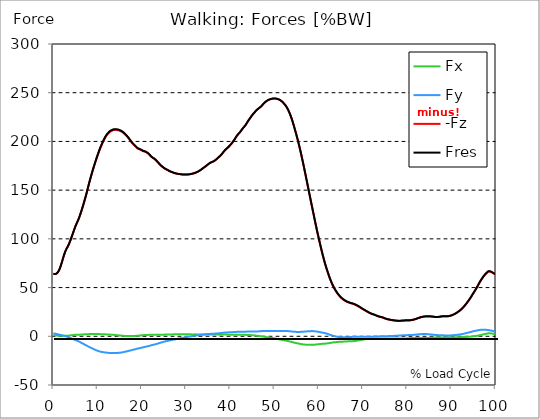
| Category |  Fx |  Fy |  -Fz |  Fres |
|---|---|---|---|---|
| 0.0 | 1.234 | 3.096 | 64.04 | 64.142 |
| 0.167348456675344 | 1.119 | 2.885 | 63.886 | 63.972 |
| 0.334696913350688 | 0.994 | 2.696 | 63.828 | 63.902 |
| 0.5020453700260321 | 0.894 | 2.522 | 63.906 | 63.97 |
| 0.669393826701376 | 0.805 | 2.358 | 64.155 | 64.212 |
| 0.83674228337672 | 0.72 | 2.203 | 64.686 | 64.738 |
| 1.0040907400520642 | 0.668 | 2.036 | 65.62 | 65.666 |
| 1.1621420602454444 | 0.618 | 1.858 | 66.815 | 66.855 |
| 1.3294905169207885 | 0.573 | 1.696 | 68.214 | 68.249 |
| 1.4968389735961325 | 0.542 | 1.52 | 70.073 | 70.104 |
| 1.6641874302714765 | 0.519 | 1.338 | 72.213 | 72.241 |
| 1.8315358869468206 | 0.505 | 1.149 | 74.565 | 74.589 |
| 1.9988843436221646 | 0.51 | 0.959 | 77.125 | 77.146 |
| 2.1662328002975086 | 0.519 | 0.793 | 79.744 | 79.764 |
| 2.333581256972853 | 0.524 | 0.645 | 82.282 | 82.3 |
| 2.5009297136481967 | 0.534 | 0.497 | 84.586 | 84.603 |
| 2.6682781703235405 | 0.558 | 0.31 | 86.686 | 86.703 |
| 2.8356266269988843 | 0.589 | 0.061 | 88.453 | 88.471 |
| 3.002975083674229 | 0.609 | -0.251 | 89.998 | 90.018 |
| 3.1703235403495724 | 0.63 | -0.571 | 91.43 | 91.454 |
| 3.337671997024917 | 0.657 | -0.892 | 92.795 | 92.823 |
| 3.4957233172182973 | 0.73 | -1.174 | 94.458 | 94.488 |
| 3.663071773893641 | 0.81 | -1.455 | 96.182 | 96.215 |
| 3.8304202305689854 | 0.912 | -1.748 | 98.15 | 98.191 |
| 3.997768687244329 | 1.029 | -2.046 | 100.228 | 100.277 |
| 4.165117143919673 | 1.139 | -2.332 | 102.373 | 102.429 |
| 4.332465600595017 | 1.227 | -2.623 | 104.51 | 104.573 |
| 4.499814057270361 | 1.304 | -2.924 | 106.62 | 106.692 |
| 4.667162513945706 | 1.385 | -3.246 | 108.829 | 108.913 |
| 4.834510970621049 | 1.448 | -3.563 | 110.949 | 111.044 |
| 5.001859427296393 | 1.503 | -3.879 | 112.944 | 113.049 |
| 5.169207883971737 | 1.531 | -4.189 | 114.746 | 114.862 |
| 5.336556340647081 | 1.545 | -4.502 | 116.469 | 116.594 |
| 5.503904797322425 | 1.55 | -4.815 | 118.131 | 118.264 |
| 5.671253253997769 | 1.565 | -5.146 | 119.854 | 119.998 |
| 5.82930457419115 | 1.596 | -5.5 | 121.768 | 121.926 |
| 5.996653030866494 | 1.636 | -5.866 | 123.89 | 124.063 |
| 6.164001487541838 | 1.689 | -6.255 | 126.108 | 126.298 |
| 6.331349944217181 | 1.753 | -6.666 | 128.408 | 128.617 |
| 6.498698400892526 | 1.808 | -7.069 | 130.806 | 131.035 |
| 6.66604685756787 | 1.866 | -7.482 | 133.273 | 133.523 |
| 6.833395314243213 | 1.921 | -7.89 | 135.807 | 136.077 |
| 7.000743770918558 | 1.983 | -8.295 | 138.384 | 138.675 |
| 7.168092227593902 | 2.057 | -8.72 | 140.992 | 141.306 |
| 7.335440684269246 | 2.1 | -9.121 | 143.683 | 144.017 |
| 7.50278914094459 | 2.141 | -9.514 | 146.497 | 146.852 |
| 7.6701375976199335 | 2.157 | -9.901 | 149.419 | 149.794 |
| 7.837486054295278 | 2.178 | -10.296 | 152.395 | 152.789 |
| 7.995537374488658 | 2.205 | -10.691 | 155.434 | 155.846 |
| 8.162885831164003 | 2.228 | -11.085 | 158.328 | 158.761 |
| 8.330234287839346 | 2.261 | -11.45 | 161.122 | 161.573 |
| 8.49758274451469 | 2.277 | -11.814 | 163.797 | 164.268 |
| 8.664931201190035 | 2.294 | -12.178 | 166.418 | 166.908 |
| 8.832279657865378 | 2.306 | -12.547 | 169 | 169.51 |
| 8.999628114540721 | 2.309 | -12.913 | 171.503 | 172.034 |
| 9.166976571216066 | 2.305 | -13.276 | 173.952 | 174.503 |
| 9.334325027891412 | 2.299 | -13.63 | 176.349 | 176.92 |
| 9.501673484566755 | 2.292 | -13.973 | 178.718 | 179.309 |
| 9.669021941242098 | 2.285 | -14.305 | 181.054 | 181.665 |
| 9.836370397917442 | 2.28 | -14.607 | 183.32 | 183.947 |
| 10.003718854592787 | 2.274 | -14.873 | 185.488 | 186.131 |
| 10.17106731126813 | 2.264 | -15.125 | 187.621 | 188.275 |
| 10.329118631461512 | 2.254 | -15.366 | 189.712 | 190.38 |
| 10.496467088136853 | 2.232 | -15.599 | 191.74 | 192.42 |
| 10.663815544812199 | 2.205 | -15.808 | 193.682 | 194.372 |
| 10.831164001487544 | 2.173 | -15.979 | 195.488 | 196.186 |
| 10.998512458162887 | 2.138 | -16.119 | 197.199 | 197.901 |
| 11.16586091483823 | 2.105 | -16.252 | 198.85 | 199.558 |
| 11.333209371513574 | 2.073 | -16.383 | 200.485 | 201.199 |
| 11.50055782818892 | 2.04 | -16.499 | 202.03 | 202.747 |
| 11.667906284864264 | 2.011 | -16.598 | 203.485 | 204.205 |
| 11.835254741539607 | 1.977 | -16.69 | 204.833 | 205.556 |
| 12.00260319821495 | 1.948 | -16.764 | 205.995 | 206.72 |
| 12.169951654890292 | 1.914 | -16.841 | 207.007 | 207.735 |
| 12.337300111565641 | 1.867 | -16.933 | 207.898 | 208.631 |
| 12.504648568240984 | 1.816 | -17.022 | 208.703 | 209.438 |
| 12.662699888434362 | 1.765 | -17.093 | 209.427 | 210.167 |
| 12.830048345109708 | 1.719 | -17.132 | 210.096 | 210.835 |
| 12.997396801785053 | 1.661 | -17.18 | 210.535 | 211.277 |
| 13.164745258460396 | 1.596 | -17.212 | 210.859 | 211.602 |
| 13.33209371513574 | 1.547 | -17.23 | 211.186 | 211.929 |
| 13.499442171811083 | 1.493 | -17.256 | 211.499 | 212.242 |
| 13.666790628486426 | 1.436 | -17.278 | 211.768 | 212.511 |
| 13.834139085161771 | 1.367 | -17.266 | 211.944 | 212.685 |
| 14.001487541837117 | 1.287 | -17.238 | 211.913 | 212.653 |
| 14.16883599851246 | 1.225 | -17.191 | 211.855 | 212.591 |
| 14.336184455187803 | 1.148 | -17.126 | 211.776 | 212.508 |
| 14.503532911863147 | 1.057 | -17.051 | 211.668 | 212.397 |
| 14.670881368538492 | 0.978 | -17.001 | 211.485 | 212.211 |
| 14.828932688731873 | 0.921 | -16.948 | 211.244 | 211.967 |
| 14.996281145407215 | 0.876 | -16.878 | 210.952 | 211.672 |
| 15.163629602082558 | 0.809 | -16.78 | 210.609 | 211.324 |
| 15.330978058757903 | 0.743 | -16.674 | 210.253 | 210.961 |
| 15.498326515433247 | 0.672 | -16.571 | 209.864 | 210.567 |
| 15.665674972108594 | 0.59 | -16.45 | 209.35 | 210.046 |
| 15.833023428783937 | 0.486 | -16.269 | 208.73 | 209.415 |
| 16.00037188545928 | 0.402 | -16.074 | 208.102 | 208.774 |
| 16.167720342134626 | 0.366 | -15.902 | 207.45 | 208.111 |
| 16.335068798809967 | 0.322 | -15.745 | 206.676 | 207.328 |
| 16.502417255485312 | 0.299 | -15.554 | 205.845 | 206.485 |
| 16.669765712160658 | 0.3 | -15.355 | 205.004 | 205.633 |
| 16.837114168836 | 0.31 | -15.167 | 204.16 | 204.778 |
| 17.004462625511344 | 0.309 | -15 | 203.239 | 203.846 |
| 17.16251394570472 | 0.285 | -14.846 | 202.262 | 202.862 |
| 17.32986240238007 | 0.261 | -14.652 | 201.124 | 201.712 |
| 17.497210859055414 | 0.265 | -14.458 | 200.014 | 200.59 |
| 17.664559315730756 | 0.269 | -14.289 | 199.11 | 199.677 |
| 17.8319077724061 | 0.276 | -14.071 | 198.21 | 198.764 |
| 17.999256229081443 | 0.298 | -13.86 | 197.396 | 197.937 |
| 18.166604685756788 | 0.33 | -13.65 | 196.625 | 197.154 |
| 18.333953142432133 | 0.374 | -13.453 | 195.865 | 196.383 |
| 18.501301599107478 | 0.415 | -13.271 | 195.061 | 195.569 |
| 18.668650055782823 | 0.455 | -13.082 | 194.271 | 194.77 |
| 18.835998512458165 | 0.493 | -12.864 | 193.561 | 194.049 |
| 19.00334696913351 | 0.532 | -12.655 | 192.92 | 193.396 |
| 19.170695425808855 | 0.593 | -12.49 | 192.456 | 192.924 |
| 19.338043882484197 | 0.673 | -12.356 | 192.122 | 192.583 |
| 19.496095202677576 | 0.759 | -12.192 | 191.891 | 192.343 |
| 19.66344365935292 | 0.845 | -12.015 | 191.654 | 192.097 |
| 19.830792116028263 | 0.941 | -11.837 | 191.172 | 191.605 |
| 19.998140572703612 | 1.02 | -11.663 | 190.596 | 191.022 |
| 20.165489029378953 | 1.097 | -11.461 | 190.273 | 190.691 |
| 20.3328374860543 | 1.171 | -11.27 | 189.975 | 190.387 |
| 20.500185942729644 | 1.247 | -11.094 | 189.77 | 190.175 |
| 20.667534399404985 | 1.311 | -10.917 | 189.557 | 189.954 |
| 20.83488285608033 | 1.341 | -10.742 | 189.265 | 189.656 |
| 21.002231312755672 | 1.359 | -10.574 | 188.857 | 189.239 |
| 21.16957976943102 | 1.386 | -10.43 | 188.415 | 188.79 |
| 21.336928226106362 | 1.407 | -10.269 | 187.952 | 188.32 |
| 21.504276682781704 | 1.43 | -10.086 | 187.368 | 187.725 |
| 21.67162513945705 | 1.466 | -9.875 | 186.606 | 186.95 |
| 21.82967645965043 | 1.493 | -9.648 | 185.761 | 186.092 |
| 21.997024916325774 | 1.497 | -9.424 | 184.864 | 185.182 |
| 22.16437337300112 | 1.507 | -9.219 | 184.121 | 184.427 |
| 22.33172182967646 | 1.51 | -8.997 | 183.518 | 183.814 |
| 22.499070286351806 | 1.51 | -8.785 | 183.014 | 183.303 |
| 22.666418743027148 | 1.519 | -8.603 | 182.566 | 182.848 |
| 22.833767199702496 | 1.555 | -8.476 | 182.073 | 182.35 |
| 23.00111565637784 | 1.564 | -8.305 | 181.524 | 181.793 |
| 23.168464113053183 | 1.574 | -8.087 | 180.813 | 181.07 |
| 23.335812569728528 | 1.574 | -7.859 | 180.006 | 180.252 |
| 23.50316102640387 | 1.561 | -7.633 | 179.185 | 179.419 |
| 23.670509483079215 | 1.553 | -7.41 | 178.362 | 178.587 |
| 23.83785793975456 | 1.558 | -7.15 | 177.503 | 177.715 |
| 23.995909259947936 | 1.574 | -6.894 | 176.67 | 176.869 |
| 24.163257716623285 | 1.604 | -6.689 | 175.918 | 176.108 |
| 24.330606173298627 | 1.631 | -6.489 | 175.17 | 175.35 |
| 24.49795462997397 | 1.642 | -6.271 | 174.492 | 174.661 |
| 24.665303086649313 | 1.666 | -6.052 | 173.914 | 174.075 |
| 24.83265154332466 | 1.685 | -5.825 | 173.338 | 173.488 |
| 25.0 | 1.693 | -5.599 | 172.754 | 172.896 |
| 25.167348456675345 | 1.727 | -5.406 | 172.243 | 172.378 |
| 25.334696913350694 | 1.764 | -5.227 | 171.788 | 171.917 |
| 25.502045370026035 | 1.795 | -5.051 | 171.351 | 171.475 |
| 25.669393826701377 | 1.809 | -4.873 | 170.982 | 171.1 |
| 25.836742283376722 | 1.82 | -4.699 | 170.607 | 170.72 |
| 26.004090740052067 | 1.832 | -4.525 | 170.221 | 170.328 |
| 26.17143919672741 | 1.833 | -4.356 | 169.776 | 169.876 |
| 26.329490516920792 | 1.842 | -4.204 | 169.373 | 169.469 |
| 26.49683897359613 | 1.857 | -4.042 | 169.011 | 169.103 |
| 26.66418743027148 | 1.892 | -3.881 | 168.71 | 168.798 |
| 26.831535886946828 | 1.93 | -3.726 | 168.445 | 168.53 |
| 26.998884343622166 | 1.956 | -3.573 | 168.175 | 168.258 |
| 27.166232800297514 | 1.981 | -3.417 | 167.886 | 167.967 |
| 27.333581256972852 | 1.993 | -3.274 | 167.592 | 167.67 |
| 27.5009297136482 | 2.013 | -3.125 | 167.343 | 167.417 |
| 27.668278170323543 | 2.035 | -2.972 | 167.126 | 167.196 |
| 27.835626626998888 | 2.049 | -2.811 | 166.964 | 167.032 |
| 28.002975083674233 | 2.057 | -2.654 | 166.821 | 166.884 |
| 28.170323540349575 | 2.069 | -2.504 | 166.692 | 166.753 |
| 28.33767199702492 | 2.077 | -2.358 | 166.57 | 166.628 |
| 28.50502045370026 | 2.081 | -2.211 | 166.455 | 166.512 |
| 28.663071773893645 | 2.084 | -2.076 | 166.345 | 166.398 |
| 28.830420230568986 | 2.08 | -1.949 | 166.258 | 166.31 |
| 28.99776868724433 | 2.069 | -1.827 | 166.175 | 166.226 |
| 29.165117143919673 | 2.055 | -1.7 | 166.098 | 166.146 |
| 29.33246560059502 | 2.053 | -1.546 | 166.044 | 166.089 |
| 29.499814057270367 | 2.052 | -1.386 | 165.994 | 166.036 |
| 29.66716251394571 | 2.044 | -1.24 | 165.987 | 166.028 |
| 29.834510970621054 | 2.031 | -1.098 | 165.983 | 166.021 |
| 30.00185942729639 | 2.02 | -0.944 | 166.004 | 166.041 |
| 30.169207883971744 | 2.017 | -0.786 | 166.036 | 166.069 |
| 30.33655634064708 | 2.01 | -0.626 | 166.067 | 166.098 |
| 30.50390479732243 | 1.996 | -0.479 | 166.132 | 166.161 |
| 30.671253253997772 | 1.979 | -0.342 | 166.223 | 166.252 |
| 30.829304574191156 | 1.97 | -0.214 | 166.321 | 166.347 |
| 30.996653030866494 | 1.966 | -0.084 | 166.451 | 166.477 |
| 31.164001487541842 | 1.96 | 0.042 | 166.604 | 166.628 |
| 31.331349944217187 | 1.956 | 0.161 | 166.776 | 166.799 |
| 31.498698400892525 | 1.953 | 0.279 | 166.953 | 166.977 |
| 31.666046857567874 | 1.95 | 0.402 | 167.162 | 167.186 |
| 31.833395314243212 | 1.954 | 0.518 | 167.401 | 167.425 |
| 32.00074377091856 | 1.962 | 0.63 | 167.667 | 167.689 |
| 32.1680922275939 | 1.965 | 0.746 | 167.949 | 167.971 |
| 32.33544068426925 | 1.961 | 0.859 | 168.251 | 168.273 |
| 32.50278914094459 | 1.954 | 0.968 | 168.571 | 168.594 |
| 32.670137597619934 | 1.949 | 1.073 | 168.941 | 168.964 |
| 32.83748605429528 | 1.946 | 1.183 | 169.382 | 169.406 |
| 33.004834510970625 | 1.946 | 1.287 | 169.843 | 169.867 |
| 33.162885831164004 | 1.948 | 1.382 | 170.321 | 170.345 |
| 33.33023428783935 | 1.948 | 1.471 | 170.796 | 170.822 |
| 33.497582744514695 | 1.943 | 1.552 | 171.349 | 171.376 |
| 33.664931201190036 | 1.933 | 1.634 | 171.99 | 172.017 |
| 33.83227965786538 | 1.926 | 1.726 | 172.527 | 172.555 |
| 33.99962811454073 | 1.914 | 1.818 | 173.053 | 173.081 |
| 34.16697657121607 | 1.897 | 1.924 | 173.589 | 173.618 |
| 34.33432502789141 | 1.881 | 2.029 | 174.127 | 174.157 |
| 34.50167348456676 | 1.873 | 2.117 | 174.709 | 174.74 |
| 34.6690219412421 | 1.868 | 2.184 | 175.298 | 175.33 |
| 34.83637039791744 | 1.86 | 2.246 | 175.939 | 175.971 |
| 35.00371885459279 | 1.854 | 2.309 | 176.567 | 176.6 |
| 35.17106731126814 | 1.835 | 2.347 | 177.151 | 177.184 |
| 35.338415767943474 | 1.831 | 2.406 | 177.667 | 177.701 |
| 35.49646708813686 | 1.816 | 2.468 | 178.122 | 178.155 |
| 35.6638155448122 | 1.796 | 2.522 | 178.485 | 178.519 |
| 35.831164001487544 | 1.778 | 2.568 | 178.814 | 178.847 |
| 35.998512458162885 | 1.759 | 2.598 | 179.111 | 179.144 |
| 36.165860914838234 | 1.74 | 2.621 | 179.41 | 179.443 |
| 36.333209371513576 | 1.718 | 2.655 | 179.859 | 179.892 |
| 36.50055782818892 | 1.712 | 2.708 | 180.383 | 180.417 |
| 36.667906284864266 | 1.711 | 2.758 | 180.939 | 180.975 |
| 36.83525474153961 | 1.711 | 2.812 | 181.545 | 181.58 |
| 37.002603198214956 | 1.705 | 2.873 | 182.205 | 182.241 |
| 37.1699516548903 | 1.705 | 2.952 | 182.899 | 182.937 |
| 37.337300111565646 | 1.705 | 3.051 | 183.601 | 183.64 |
| 37.50464856824098 | 1.701 | 3.143 | 184.325 | 184.366 |
| 37.66269988843437 | 1.696 | 3.22 | 184.979 | 185.021 |
| 37.83004834510971 | 1.695 | 3.295 | 185.693 | 185.737 |
| 37.99739680178505 | 1.7 | 3.373 | 186.519 | 186.564 |
| 38.16474525846039 | 1.711 | 3.461 | 187.418 | 187.464 |
| 38.33209371513574 | 1.728 | 3.571 | 188.42 | 188.469 |
| 38.49944217181109 | 1.747 | 3.669 | 189.387 | 189.438 |
| 38.666790628486424 | 1.759 | 3.761 | 190.301 | 190.354 |
| 38.83413908516178 | 1.76 | 3.832 | 191.146 | 191.2 |
| 39.001487541837115 | 1.759 | 3.896 | 191.942 | 191.996 |
| 39.16883599851246 | 1.754 | 3.936 | 192.592 | 192.648 |
| 39.336184455187805 | 1.725 | 3.971 | 193.244 | 193.299 |
| 39.503532911863154 | 1.693 | 4.005 | 193.901 | 193.958 |
| 39.670881368538495 | 1.678 | 4.04 | 194.699 | 194.756 |
| 39.83822982521384 | 1.663 | 4.069 | 195.459 | 195.515 |
| 39.996281145407224 | 1.652 | 4.1 | 196.238 | 196.295 |
| 40.163629602082565 | 1.645 | 4.134 | 197.092 | 197.151 |
| 40.33097805875791 | 1.646 | 4.176 | 198.025 | 198.084 |
| 40.498326515433256 | 1.645 | 4.224 | 199.003 | 199.063 |
| 40.6656749721086 | 1.64 | 4.268 | 200.019 | 200.079 |
| 40.83302342878393 | 1.628 | 4.317 | 201.092 | 201.153 |
| 41.00037188545929 | 1.628 | 4.376 | 202.228 | 202.29 |
| 41.16772034213463 | 1.632 | 4.441 | 203.447 | 203.511 |
| 41.33506879880997 | 1.632 | 4.496 | 204.689 | 204.754 |
| 41.50241725548531 | 1.625 | 4.538 | 205.813 | 205.879 |
| 41.66976571216066 | 1.611 | 4.582 | 206.796 | 206.862 |
| 41.837114168836 | 1.59 | 4.607 | 207.701 | 207.768 |
| 42.004462625511344 | 1.563 | 4.613 | 208.477 | 208.542 |
| 42.17181108218669 | 1.54 | 4.621 | 209.269 | 209.334 |
| 42.32986240238007 | 1.542 | 4.642 | 210.195 | 210.262 |
| 42.497210859055414 | 1.552 | 4.667 | 211.308 | 211.375 |
| 42.66455931573076 | 1.566 | 4.687 | 212.427 | 212.495 |
| 42.831907772406105 | 1.555 | 4.708 | 213.423 | 213.49 |
| 42.999256229081446 | 1.529 | 4.713 | 214.294 | 214.362 |
| 43.16660468575679 | 1.499 | 4.717 | 215.117 | 215.185 |
| 43.33395314243214 | 1.468 | 4.726 | 216.025 | 216.093 |
| 43.50130159910748 | 1.443 | 4.745 | 217.101 | 217.17 |
| 43.66865005578282 | 1.42 | 4.77 | 218.254 | 218.323 |
| 43.83599851245817 | 1.392 | 4.807 | 219.48 | 219.549 |
| 44.00334696913351 | 1.36 | 4.834 | 220.729 | 220.799 |
| 44.17069542580886 | 1.332 | 4.857 | 221.857 | 221.927 |
| 44.3380438824842 | 1.304 | 4.87 | 222.941 | 223.011 |
| 44.49609520267758 | 1.26 | 4.866 | 223.996 | 224.066 |
| 44.66344365935292 | 1.197 | 4.865 | 225.09 | 225.159 |
| 44.83079211602827 | 1.125 | 4.88 | 226.199 | 226.266 |
| 44.99814057270361 | 1.053 | 4.889 | 227.191 | 227.259 |
| 45.16548902937895 | 0.989 | 4.885 | 228.089 | 228.157 |
| 45.332837486054295 | 0.928 | 4.894 | 228.948 | 229.016 |
| 45.500185942729644 | 0.864 | 4.911 | 229.81 | 229.878 |
| 45.66753439940499 | 0.79 | 4.932 | 230.727 | 230.795 |
| 45.83488285608033 | 0.707 | 4.948 | 231.604 | 231.672 |
| 46.00223131275568 | 0.618 | 4.966 | 232.343 | 232.411 |
| 46.16957976943102 | 0.524 | 4.99 | 232.987 | 233.056 |
| 46.336928226106366 | 0.418 | 5.046 | 233.58 | 233.65 |
| 46.50427668278171 | 0.306 | 5.11 | 234.162 | 234.235 |
| 46.671625139457056 | 0.196 | 5.179 | 234.734 | 234.807 |
| 46.829676459650436 | 0.087 | 5.251 | 235.329 | 235.403 |
| 46.99702491632577 | -0.019 | 5.306 | 236.048 | 236.124 |
| 47.16437337300112 | -0.133 | 5.344 | 236.852 | 236.929 |
| 47.33172182967646 | -0.245 | 5.375 | 237.714 | 237.792 |
| 47.49907028635181 | -0.366 | 5.415 | 238.611 | 238.69 |
| 47.66641874302716 | -0.485 | 5.442 | 239.387 | 239.466 |
| 47.83376719970249 | -0.606 | 5.463 | 240.088 | 240.167 |
| 48.001115656377834 | -0.724 | 5.473 | 240.745 | 240.825 |
| 48.16846411305319 | -0.854 | 5.469 | 241.321 | 241.4 |
| 48.33581256972853 | -0.979 | 5.468 | 241.813 | 241.893 |
| 48.50316102640387 | -1.087 | 5.471 | 242.243 | 242.323 |
| 48.67050948307921 | -1.182 | 5.48 | 242.637 | 242.718 |
| 48.837857939754564 | -1.283 | 5.5 | 243.013 | 243.093 |
| 49.005206396429905 | -1.42 | 5.485 | 243.278 | 243.361 |
| 49.163257716623285 | -1.554 | 5.464 | 243.472 | 243.554 |
| 49.33060617329863 | -1.688 | 5.48 | 243.666 | 243.748 |
| 49.49795462997397 | -1.822 | 5.49 | 243.833 | 243.916 |
| 49.66530308664932 | -1.948 | 5.49 | 243.953 | 244.037 |
| 49.832651543324666 | -2.047 | 5.494 | 244.023 | 244.107 |
| 50.0 | -2.196 | 5.497 | 244.011 | 244.096 |
| 50.16734845667534 | -2.352 | 5.513 | 243.971 | 244.058 |
| 50.33469691335069 | -2.484 | 5.492 | 243.899 | 243.987 |
| 50.50204537002604 | -2.624 | 5.481 | 243.752 | 243.842 |
| 50.66939382670139 | -2.762 | 5.464 | 243.541 | 243.632 |
| 50.836742283376715 | -2.902 | 5.444 | 243.288 | 243.379 |
| 51.00409074005207 | -3.063 | 5.447 | 242.983 | 243.076 |
| 51.17143919672741 | -3.207 | 5.444 | 242.613 | 242.708 |
| 51.32949051692079 | -3.35 | 5.445 | 242.155 | 242.253 |
| 51.496838973596134 | -3.494 | 5.442 | 241.642 | 241.742 |
| 51.66418743027148 | -3.653 | 5.464 | 241.086 | 241.188 |
| 51.831535886946824 | -3.808 | 5.48 | 240.382 | 240.488 |
| 51.99888434362217 | -3.945 | 5.465 | 239.567 | 239.674 |
| 52.16623280029752 | -4.085 | 5.442 | 238.705 | 238.815 |
| 52.33358125697285 | -4.234 | 5.421 | 237.81 | 237.921 |
| 52.5009297136482 | -4.389 | 5.406 | 236.826 | 236.941 |
| 52.668278170323546 | -4.545 | 5.401 | 235.686 | 235.804 |
| 52.835626626998895 | -4.699 | 5.383 | 234.446 | 234.567 |
| 53.00297508367424 | -4.855 | 5.349 | 233.098 | 233.222 |
| 53.17032354034958 | -5.012 | 5.287 | 231.53 | 231.656 |
| 53.33767199702492 | -5.186 | 5.227 | 229.845 | 229.976 |
| 53.50502045370027 | -5.373 | 5.125 | 227.98 | 228.113 |
| 53.663071773893655 | -5.562 | 5.038 | 226.035 | 226.172 |
| 53.83042023056899 | -5.76 | 4.952 | 223.935 | 224.076 |
| 53.99776868724433 | -5.965 | 4.847 | 221.625 | 221.771 |
| 54.16511714391967 | -6.168 | 4.758 | 219.186 | 219.335 |
| 54.33246560059503 | -6.366 | 4.679 | 216.623 | 216.778 |
| 54.49981405727037 | -6.555 | 4.611 | 213.999 | 214.16 |
| 54.667162513945705 | -6.729 | 4.566 | 211.32 | 211.487 |
| 54.834510970621054 | -6.895 | 4.531 | 208.588 | 208.762 |
| 55.0018594272964 | -7.054 | 4.499 | 205.81 | 205.99 |
| 55.169207883971744 | -7.208 | 4.472 | 202.985 | 203.173 |
| 55.336556340647086 | -7.359 | 4.461 | 200.062 | 200.257 |
| 55.50390479732243 | -7.514 | 4.468 | 197.003 | 197.209 |
| 55.671253253997776 | -7.67 | 4.485 | 193.875 | 194.09 |
| 55.83860171067312 | -7.823 | 4.513 | 190.635 | 190.861 |
| 55.9966530308665 | -7.969 | 4.553 | 187.3 | 187.537 |
| 56.16400148754184 | -8.104 | 4.607 | 183.876 | 184.125 |
| 56.33134994421718 | -8.227 | 4.672 | 180.408 | 180.669 |
| 56.498698400892536 | -8.343 | 4.741 | 176.876 | 177.15 |
| 56.66604685756788 | -8.453 | 4.808 | 173.258 | 173.545 |
| 56.83339531424321 | -8.545 | 4.872 | 169.604 | 169.901 |
| 57.00074377091856 | -8.619 | 4.935 | 165.945 | 166.254 |
| 57.16809222759391 | -8.672 | 4.993 | 162.217 | 162.537 |
| 57.33544068426925 | -8.703 | 5.036 | 158.505 | 158.837 |
| 57.5027891409446 | -8.735 | 5.085 | 154.765 | 155.108 |
| 57.670137597619934 | -8.76 | 5.142 | 151.007 | 151.362 |
| 57.83748605429528 | -8.772 | 5.196 | 147.232 | 147.598 |
| 58.004834510970625 | -8.783 | 5.24 | 143.541 | 143.917 |
| 58.16288583116401 | -8.787 | 5.28 | 139.815 | 140.203 |
| 58.330234287839346 | -8.782 | 5.306 | 136.108 | 136.506 |
| 58.497582744514695 | -8.763 | 5.313 | 132.424 | 132.831 |
| 58.66493120119004 | -8.729 | 5.296 | 128.794 | 129.209 |
| 58.832279657865385 | -8.678 | 5.236 | 125.139 | 125.559 |
| 58.999628114540734 | -8.617 | 5.165 | 121.453 | 121.879 |
| 59.16697657121607 | -8.548 | 5.089 | 117.791 | 118.221 |
| 59.33432502789142 | -8.473 | 5.01 | 114.161 | 114.596 |
| 59.50167348456676 | -8.391 | 4.921 | 110.579 | 111.016 |
| 59.66902194124211 | -8.299 | 4.811 | 107.096 | 107.535 |
| 59.83637039791745 | -8.207 | 4.684 | 103.701 | 104.141 |
| 60.00371885459278 | -8.111 | 4.554 | 100.376 | 100.816 |
| 60.17106731126813 | -8.018 | 4.41 | 97.116 | 97.556 |
| 60.33841576794349 | -7.93 | 4.243 | 93.889 | 94.328 |
| 60.49646708813685 | -7.843 | 4.07 | 90.694 | 91.134 |
| 60.6638155448122 | -7.766 | 3.91 | 87.58 | 88.02 |
| 60.831164001487544 | -7.711 | 3.759 | 84.546 | 84.99 |
| 60.99851245816289 | -7.662 | 3.611 | 81.553 | 82.003 |
| 61.16586091483824 | -7.623 | 3.468 | 78.646 | 79.102 |
| 61.333209371513576 | -7.588 | 3.329 | 75.881 | 76.342 |
| 61.50055782818892 | -7.528 | 3.161 | 73.246 | 73.709 |
| 61.667906284864266 | -7.436 | 2.948 | 70.769 | 71.228 |
| 61.835254741539615 | -7.345 | 2.729 | 68.358 | 68.814 |
| 62.002603198214956 | -7.238 | 2.476 | 66.031 | 66.482 |
| 62.16995165489029 | -7.116 | 2.195 | 63.748 | 64.19 |
| 62.33730011156564 | -6.992 | 1.92 | 61.552 | 61.985 |
| 62.504648568240995 | -6.873 | 1.652 | 59.443 | 59.869 |
| 62.67199702491633 | -6.743 | 1.384 | 57.48 | 57.899 |
| 62.83004834510971 | -6.61 | 1.125 | 55.654 | 56.067 |
| 62.99739680178505 | -6.49 | 0.866 | 53.919 | 54.326 |
| 63.1647452584604 | -6.368 | 0.619 | 52.214 | 52.615 |
| 63.33209371513575 | -6.268 | 0.397 | 50.648 | 51.046 |
| 63.4994421718111 | -6.182 | 0.193 | 49.2 | 49.596 |
| 63.666790628486424 | -6.109 | 0.017 | 47.907 | 48.303 |
| 63.83413908516177 | -6.027 | -0.15 | 46.669 | 47.065 |
| 64.00148754183712 | -5.943 | -0.306 | 45.463 | 45.858 |
| 64.16883599851248 | -5.875 | -0.442 | 44.358 | 44.756 |
| 64.3361844551878 | -5.816 | -0.568 | 43.32 | 43.72 |
| 64.50353291186315 | -5.762 | -0.674 | 42.37 | 42.772 |
| 64.6708813685385 | -5.689 | -0.776 | 41.435 | 41.839 |
| 64.83822982521384 | -5.642 | -0.842 | 40.581 | 40.986 |
| 65.00557828188919 | -5.606 | -0.892 | 39.801 | 40.211 |
| 65.16362960208257 | -5.573 | -0.945 | 39.082 | 39.495 |
| 65.3309780587579 | -5.547 | -0.995 | 38.42 | 38.837 |
| 65.49832651543326 | -5.515 | -1.024 | 37.81 | 38.229 |
| 65.6656749721086 | -5.47 | -1.047 | 37.255 | 37.673 |
| 65.83302342878395 | -5.423 | -1.063 | 36.756 | 37.173 |
| 66.00037188545929 | -5.387 | -1.049 | 36.309 | 36.726 |
| 66.16772034213463 | -5.345 | -1.035 | 35.884 | 36.299 |
| 66.33506879880998 | -5.281 | -1.013 | 35.461 | 35.87 |
| 66.50241725548531 | -5.232 | -0.986 | 35.102 | 35.507 |
| 66.66976571216065 | -5.183 | -0.943 | 34.795 | 35.196 |
| 66.83711416883601 | -5.122 | -0.898 | 34.504 | 34.899 |
| 67.00446262551135 | -5.085 | -0.84 | 34.23 | 34.622 |
| 67.1718110821867 | -5.044 | -0.769 | 33.967 | 34.354 |
| 67.32986240238007 | -5.034 | -0.692 | 33.76 | 34.146 |
| 67.49721085905541 | -5.024 | -0.613 | 33.593 | 33.979 |
| 67.66455931573076 | -4.997 | -0.554 | 33.38 | 33.763 |
| 67.83190777240611 | -4.947 | -0.519 | 33.108 | 33.487 |
| 67.99925622908145 | -4.894 | -0.483 | 32.815 | 33.189 |
| 68.16660468575678 | -4.831 | -0.459 | 32.515 | 32.882 |
| 68.33395314243214 | -4.741 | -0.449 | 32.189 | 32.547 |
| 68.50130159910749 | -4.631 | -0.449 | 31.834 | 32.179 |
| 68.66865005578282 | -4.5 | -0.459 | 31.459 | 31.79 |
| 68.83599851245816 | -4.361 | -0.475 | 31.054 | 31.369 |
| 69.00334696913352 | -4.224 | -0.49 | 30.628 | 30.93 |
| 69.17069542580886 | -4.085 | -0.51 | 30.187 | 30.473 |
| 69.3380438824842 | -3.942 | -0.532 | 29.724 | 29.997 |
| 69.50539233915956 | -3.797 | -0.551 | 29.239 | 29.497 |
| 69.66344365935292 | -3.654 | -0.561 | 28.749 | 28.994 |
| 69.83079211602826 | -3.52 | -0.57 | 28.286 | 28.517 |
| 69.99814057270362 | -3.391 | -0.566 | 27.84 | 28.059 |
| 70.16548902937896 | -3.262 | -0.563 | 27.395 | 27.601 |
| 70.33283748605429 | -3.138 | -0.557 | 26.949 | 27.143 |
| 70.50018594272964 | -3.021 | -0.549 | 26.505 | 26.69 |
| 70.667534399405 | -2.92 | -0.542 | 26.069 | 26.244 |
| 70.83488285608033 | -2.827 | -0.536 | 25.643 | 25.811 |
| 71.00223131275568 | -2.747 | -0.531 | 25.215 | 25.377 |
| 71.16957976943102 | -2.673 | -0.527 | 24.79 | 24.946 |
| 71.33692822610637 | -2.607 | -0.516 | 24.383 | 24.535 |
| 71.50427668278171 | -2.566 | -0.485 | 23.993 | 24.141 |
| 71.67162513945706 | -2.517 | -0.461 | 23.625 | 23.771 |
| 71.8389735961324 | -2.466 | -0.438 | 23.272 | 23.414 |
| 71.99702491632577 | -2.418 | -0.414 | 22.943 | 23.081 |
| 72.16437337300113 | -2.384 | -0.38 | 22.663 | 22.798 |
| 72.33172182967647 | -2.366 | -0.333 | 22.445 | 22.579 |
| 72.49907028635181 | -2.354 | -0.308 | 22.212 | 22.347 |
| 72.66641874302715 | -2.339 | -0.289 | 21.939 | 22.074 |
| 72.8337671997025 | -2.316 | -0.275 | 21.621 | 21.755 |
| 73.00111565637783 | -2.294 | -0.252 | 21.292 | 21.426 |
| 73.16846411305319 | -2.285 | -0.213 | 20.97 | 21.105 |
| 73.33581256972853 | -2.274 | -0.175 | 20.661 | 20.796 |
| 73.50316102640387 | -2.262 | -0.142 | 20.381 | 20.517 |
| 73.67050948307921 | -2.273 | -0.099 | 20.148 | 20.286 |
| 73.83785793975457 | -2.306 | -0.051 | 19.969 | 20.114 |
| 74.00520639642991 | -2.345 | -0.02 | 19.795 | 19.946 |
| 74.16325771662328 | -2.347 | -0.005 | 19.632 | 19.786 |
| 74.33060617329863 | -2.31 | 0.002 | 19.418 | 19.569 |
| 74.49795462997398 | -2.306 | 0.017 | 19.151 | 19.303 |
| 74.66530308664932 | -2.293 | 0.032 | 18.877 | 19.03 |
| 74.83265154332466 | -2.254 | 0.03 | 18.547 | 18.697 |
| 75.00000000000001 | -2.232 | 0.034 | 18.235 | 18.386 |
| 75.16734845667534 | -2.228 | 0.052 | 17.943 | 18.096 |
| 75.3346969133507 | -2.214 | 0.071 | 17.711 | 17.864 |
| 75.50204537002605 | -2.222 | 0.104 | 17.514 | 17.67 |
| 75.66939382670138 | -2.227 | 0.14 | 17.333 | 17.493 |
| 75.83674228337672 | -2.237 | 0.182 | 17.169 | 17.331 |
| 76.00409074005208 | -2.266 | 0.229 | 17.029 | 17.196 |
| 76.17143919672742 | -2.283 | 0.259 | 16.878 | 17.051 |
| 76.33878765340276 | -2.279 | 0.278 | 16.714 | 16.889 |
| 76.49683897359614 | -2.266 | 0.303 | 16.567 | 16.74 |
| 76.66418743027148 | -2.254 | 0.337 | 16.441 | 16.614 |
| 76.83153588694682 | -2.24 | 0.375 | 16.328 | 16.5 |
| 76.99888434362218 | -2.218 | 0.404 | 16.224 | 16.392 |
| 77.16623280029752 | -2.176 | 0.416 | 16.117 | 16.28 |
| 77.33358125697285 | -2.161 | 0.455 | 16.028 | 16.19 |
| 77.5009297136482 | -2.157 | 0.502 | 15.947 | 16.111 |
| 77.66827817032356 | -2.18 | 0.568 | 15.896 | 16.067 |
| 77.83562662699889 | -2.195 | 0.624 | 15.84 | 16.017 |
| 78.00297508367423 | -2.199 | 0.671 | 15.792 | 15.973 |
| 78.17032354034959 | -2.195 | 0.714 | 15.753 | 15.936 |
| 78.33767199702493 | -2.193 | 0.768 | 15.762 | 15.947 |
| 78.50502045370027 | -2.212 | 0.831 | 15.813 | 16.002 |
| 78.67236891037561 | -2.249 | 0.903 | 15.876 | 16.072 |
| 78.83042023056899 | -2.274 | 0.963 | 15.938 | 16.14 |
| 78.99776868724433 | -2.277 | 1.003 | 15.993 | 16.196 |
| 79.16511714391969 | -2.278 | 1.054 | 16.054 | 16.26 |
| 79.33246560059503 | -2.257 | 1.084 | 16.105 | 16.309 |
| 79.49981405727036 | -2.256 | 1.131 | 16.143 | 16.35 |
| 79.66716251394571 | -2.24 | 1.163 | 16.162 | 16.369 |
| 79.83451097062107 | -2.183 | 1.174 | 16.153 | 16.352 |
| 80.00185942729641 | -2.118 | 1.183 | 16.142 | 16.334 |
| 80.16920788397174 | -2.063 | 1.197 | 16.178 | 16.364 |
| 80.33655634064709 | -2.002 | 1.214 | 16.227 | 16.406 |
| 80.50390479732243 | -1.931 | 1.235 | 16.303 | 16.473 |
| 80.67125325399778 | -1.867 | 1.261 | 16.381 | 16.546 |
| 80.83860171067312 | -1.804 | 1.288 | 16.461 | 16.619 |
| 80.99665303086651 | -1.751 | 1.329 | 16.571 | 16.726 |
| 81.16400148754184 | -1.702 | 1.37 | 16.722 | 16.873 |
| 81.3313499442172 | -1.677 | 1.426 | 16.887 | 17.038 |
| 81.49869840089255 | -1.67 | 1.495 | 17.073 | 17.227 |
| 81.66604685756786 | -1.657 | 1.572 | 17.283 | 17.441 |
| 81.83339531424322 | -1.666 | 1.653 | 17.52 | 17.685 |
| 82.00074377091858 | -1.674 | 1.73 | 17.768 | 17.938 |
| 82.16809222759392 | -1.706 | 1.815 | 18.032 | 18.212 |
| 82.33544068426926 | -1.725 | 1.895 | 18.29 | 18.478 |
| 82.50278914094459 | -1.736 | 1.97 | 18.562 | 18.756 |
| 82.67013759761994 | -1.759 | 2.04 | 18.848 | 19.05 |
| 82.83748605429528 | -1.777 | 2.1 | 19.118 | 19.325 |
| 83.00483451097062 | -1.786 | 2.145 | 19.325 | 19.535 |
| 83.17218296764597 | -1.8 | 2.186 | 19.515 | 19.729 |
| 83.33023428783935 | -1.814 | 2.227 | 19.713 | 19.932 |
| 83.4975827445147 | -1.846 | 2.266 | 19.889 | 20.113 |
| 83.66493120119004 | -1.865 | 2.295 | 20.031 | 20.257 |
| 83.83227965786537 | -1.876 | 2.306 | 20.142 | 20.369 |
| 83.99962811454073 | -1.88 | 2.296 | 20.229 | 20.455 |
| 84.16697657121607 | -1.861 | 2.272 | 20.273 | 20.495 |
| 84.33432502789142 | -1.829 | 2.239 | 20.307 | 20.522 |
| 84.50167348456677 | -1.787 | 2.199 | 20.338 | 20.545 |
| 84.6690219412421 | -1.748 | 2.153 | 20.356 | 20.554 |
| 84.83637039791745 | -1.691 | 2.091 | 20.347 | 20.536 |
| 85.0037188545928 | -1.644 | 2.017 | 20.313 | 20.493 |
| 85.17106731126813 | -1.611 | 1.95 | 20.279 | 20.451 |
| 85.33841576794349 | -1.598 | 1.891 | 20.263 | 20.43 |
| 85.50576422461883 | -1.569 | 1.812 | 20.228 | 20.387 |
| 85.66381554481221 | -1.51 | 1.72 | 20.177 | 20.327 |
| 85.83116400148755 | -1.45 | 1.623 | 20.089 | 20.228 |
| 85.99851245816289 | -1.389 | 1.542 | 19.973 | 20.103 |
| 86.16586091483823 | -1.338 | 1.469 | 19.827 | 19.948 |
| 86.33320937151358 | -1.268 | 1.395 | 19.76 | 19.872 |
| 86.50055782818893 | -1.188 | 1.316 | 19.731 | 19.83 |
| 86.66790628486427 | -1.132 | 1.254 | 19.737 | 19.826 |
| 86.83525474153961 | -1.099 | 1.212 | 19.764 | 19.847 |
| 87.00260319821496 | -1.085 | 1.186 | 19.814 | 19.893 |
| 87.16995165489031 | -1.083 | 1.165 | 19.902 | 19.98 |
| 87.33730011156564 | -1.084 | 1.144 | 19.999 | 20.074 |
| 87.504648568241 | -1.104 | 1.13 | 20.123 | 20.199 |
| 87.67199702491634 | -1.134 | 1.113 | 20.266 | 20.342 |
| 87.83004834510972 | -1.153 | 1.083 | 20.411 | 20.485 |
| 87.99739680178506 | -1.15 | 1.039 | 20.521 | 20.592 |
| 88.1647452584604 | -1.125 | 0.984 | 20.576 | 20.642 |
| 88.33209371513574 | -1.077 | 0.908 | 20.584 | 20.645 |
| 88.49944217181108 | -1.027 | 0.833 | 20.547 | 20.603 |
| 88.66679062848644 | -0.997 | 0.795 | 20.545 | 20.6 |
| 88.83413908516178 | -1 | 0.762 | 20.502 | 20.556 |
| 89.00148754183712 | -0.995 | 0.737 | 20.518 | 20.572 |
| 89.16883599851246 | -0.988 | 0.727 | 20.551 | 20.604 |
| 89.33618445518782 | -0.992 | 0.745 | 20.626 | 20.68 |
| 89.50353291186315 | -1.003 | 0.782 | 20.746 | 20.8 |
| 89.6708813685385 | -1.028 | 0.833 | 20.937 | 20.995 |
| 89.83822982521386 | -1.057 | 0.907 | 21.175 | 21.236 |
| 90.00557828188919 | -1.085 | 0.971 | 21.434 | 21.497 |
| 90.16362960208257 | -1.104 | 1.029 | 21.699 | 21.764 |
| 90.3309780587579 | -1.13 | 1.087 | 21.994 | 22.062 |
| 90.49832651543326 | -1.14 | 1.15 | 22.345 | 22.416 |
| 90.66567497210859 | -1.136 | 1.209 | 22.731 | 22.805 |
| 90.83302342878395 | -1.119 | 1.262 | 23.124 | 23.2 |
| 91.00037188545929 | -1.086 | 1.327 | 23.541 | 23.617 |
| 91.16772034213463 | -1.058 | 1.415 | 24.004 | 24.081 |
| 91.33506879880998 | -1.035 | 1.519 | 24.511 | 24.59 |
| 91.50241725548533 | -1.012 | 1.635 | 25.05 | 25.134 |
| 91.66976571216065 | -0.999 | 1.73 | 25.584 | 25.672 |
| 91.83711416883601 | -0.963 | 1.818 | 26.123 | 26.213 |
| 92.00446262551137 | -0.927 | 1.925 | 26.701 | 26.794 |
| 92.1718110821867 | -0.883 | 2.05 | 27.345 | 27.444 |
| 92.33915953886203 | -0.826 | 2.177 | 28.058 | 28.162 |
| 92.49721085905541 | -0.771 | 2.322 | 28.823 | 28.933 |
| 92.66455931573077 | -0.74 | 2.487 | 29.614 | 29.735 |
| 92.83190777240611 | -0.738 | 2.673 | 30.441 | 30.573 |
| 92.99925622908145 | -0.744 | 2.875 | 31.304 | 31.451 |
| 93.1666046857568 | -0.734 | 3.079 | 32.219 | 32.381 |
| 93.33395314243214 | -0.697 | 3.273 | 33.184 | 33.36 |
| 93.50130159910749 | -0.651 | 3.465 | 34.176 | 34.365 |
| 93.66865005578283 | -0.592 | 3.645 | 35.195 | 35.397 |
| 93.83599851245818 | -0.523 | 3.817 | 36.211 | 36.424 |
| 94.00334696913353 | -0.462 | 4.01 | 37.222 | 37.448 |
| 94.17069542580886 | -0.392 | 4.204 | 38.329 | 38.568 |
| 94.3380438824842 | -0.325 | 4.407 | 39.484 | 39.738 |
| 94.50539233915954 | -0.251 | 4.606 | 40.685 | 40.953 |
| 94.66344365935292 | -0.163 | 4.801 | 41.915 | 42.197 |
| 94.83079211602828 | -0.085 | 5.001 | 43.13 | 43.428 |
| 94.99814057270362 | -0.015 | 5.193 | 44.329 | 44.641 |
| 95.16548902937897 | 0.069 | 5.372 | 45.527 | 45.852 |
| 95.33283748605432 | 0.166 | 5.542 | 46.73 | 47.068 |
| 95.50018594272963 | 0.272 | 5.699 | 47.949 | 48.297 |
| 95.66753439940499 | 0.406 | 5.848 | 49.225 | 49.585 |
| 95.83488285608034 | 0.556 | 5.987 | 50.537 | 50.907 |
| 96.00223131275567 | 0.709 | 6.131 | 51.912 | 52.292 |
| 96.16957976943102 | 0.855 | 6.309 | 53.389 | 53.781 |
| 96.33692822610638 | 1.01 | 6.446 | 54.768 | 55.169 |
| 96.50427668278171 | 1.159 | 6.555 | 56.061 | 56.468 |
| 96.67162513945706 | 1.314 | 6.633 | 57.253 | 57.666 |
| 96.8389735961324 | 1.496 | 6.678 | 58.39 | 58.805 |
| 96.99702491632577 | 1.686 | 6.709 | 59.51 | 59.927 |
| 97.16437337300111 | 1.859 | 6.763 | 60.616 | 61.037 |
| 97.33172182967647 | 2.048 | 6.772 | 61.662 | 62.083 |
| 97.49907028635181 | 2.215 | 6.764 | 62.6 | 63.018 |
| 97.66641874302715 | 2.38 | 6.73 | 63.473 | 63.887 |
| 97.8337671997025 | 2.539 | 6.66 | 64.257 | 64.662 |
| 98.00111565637785 | 2.711 | 6.57 | 65.008 | 65.407 |
| 98.16846411305319 | 2.882 | 6.472 | 65.724 | 66.115 |
| 98.33581256972855 | 3.032 | 6.377 | 66.355 | 66.738 |
| 98.50316102640389 | 3.096 | 6.238 | 66.571 | 66.944 |
| 98.67050948307921 | 3.066 | 6.108 | 66.54 | 66.9 |
| 98.83785793975456 | 2.971 | 5.965 | 66.255 | 66.6 |
| 99.0052063964299 | 2.879 | 5.825 | 65.96 | 66.29 |
| 99.17255485310525 | 2.793 | 5.673 | 65.648 | 65.963 |
| 99.33060617329863 | 2.665 | 5.495 | 65.121 | 65.417 |
| 99.49795462997399 | 2.536 | 5.316 | 64.598 | 64.876 |
| 99.66530308664933 | 2.427 | 5.139 | 64.175 | 64.437 |
| 99.83265154332467 | 2.341 | 4.967 | 63.929 | 64.175 |
| 100.0 | 2.258 | 4.789 | 63.78 | 64.012 |